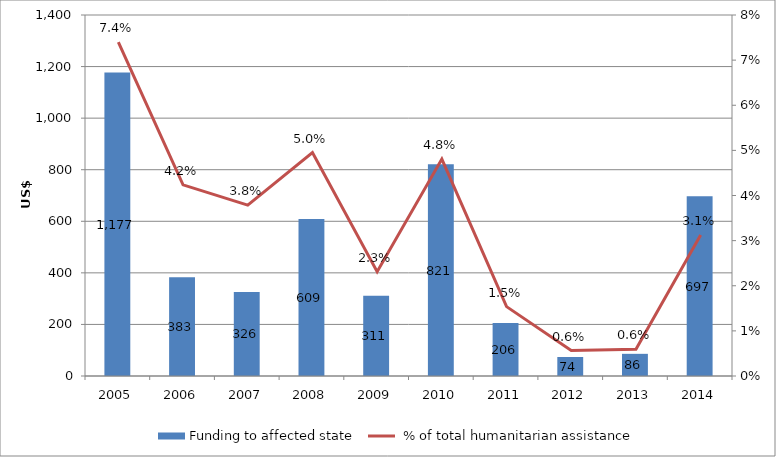
| Category | Funding to affected state |
|---|---|
| 2005.0 | 1177.319 |
| 2006.0 | 383.136 |
| 2007.0 | 325.976 |
| 2008.0 | 608.95 |
| 2009.0 | 311.408 |
| 2010.0 | 820.921 |
| 2011.0 | 205.832 |
| 2012.0 | 73.774 |
| 2013.0 | 85.971 |
| 2014.0 | 697.002 |